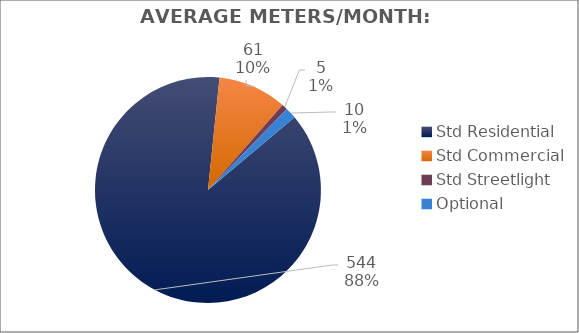
| Category | Meters |
|---|---|
| Std Residential | 544 |
| Std Commercial | 61 |
| Std Streetlight | 5 |
| Optional | 10 |